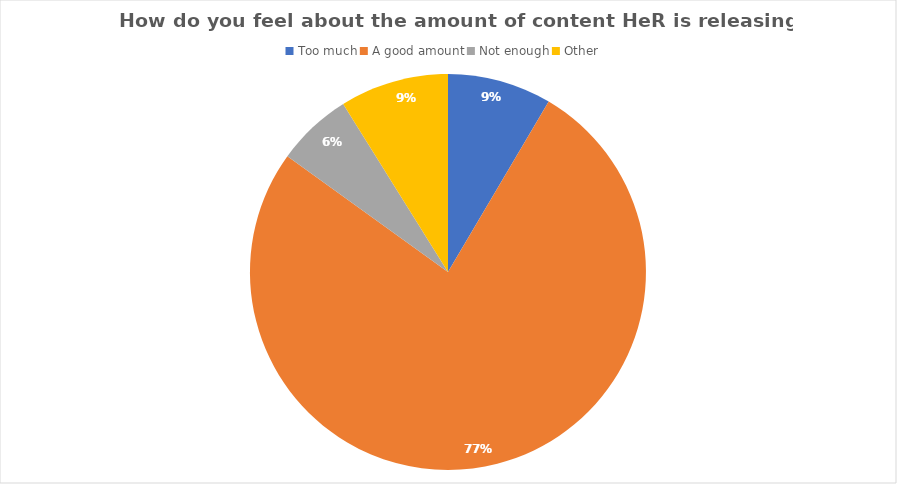
| Category | Series 0 |
|---|---|
| Too much | 22 |
| A good amount | 198 |
| Not enough | 16 |
| Other | 23 |